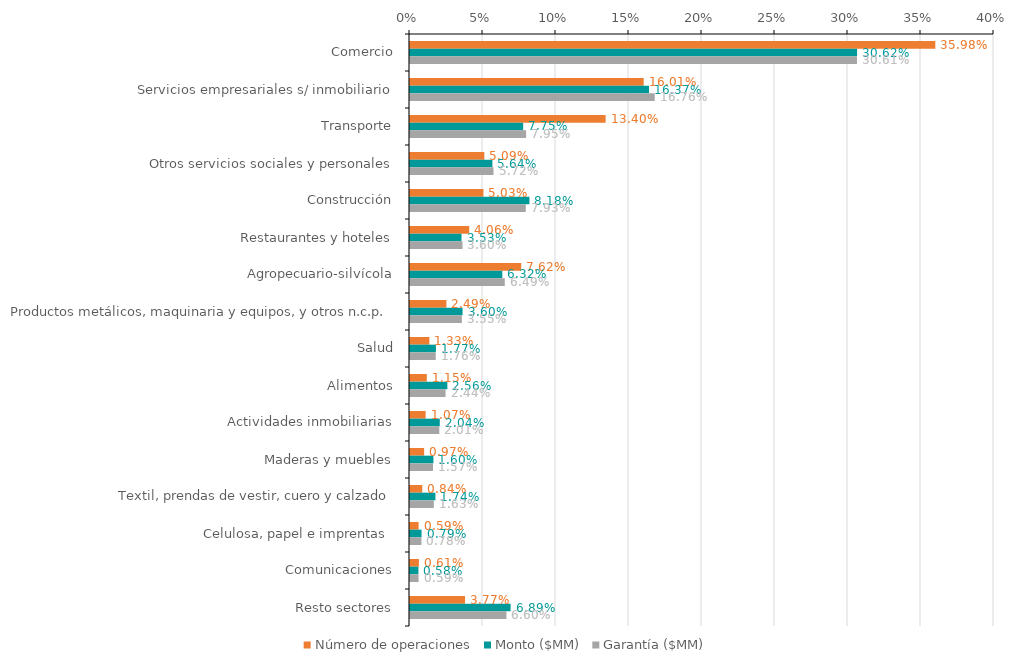
| Category | Número de operaciones | Monto ($MM) | Garantía ($MM) |
|---|---|---|---|
| Comercio | 0.36 | 0.306 | 0.306 |
| Servicios empresariales s/ inmobiliario | 0.16 | 0.164 | 0.168 |
| Transporte | 0.134 | 0.078 | 0.08 |
| Otros servicios sociales y personales | 0.051 | 0.056 | 0.057 |
| Construcción | 0.05 | 0.082 | 0.079 |
| Restaurantes y hoteles | 0.041 | 0.035 | 0.036 |
| Agropecuario-silvícola | 0.076 | 0.063 | 0.065 |
| Productos metálicos, maquinaria y equipos, y otros n.c.p. | 0.025 | 0.036 | 0.036 |
| Salud | 0.013 | 0.018 | 0.018 |
| Alimentos | 0.012 | 0.026 | 0.024 |
| Actividades inmobiliarias | 0.011 | 0.02 | 0.02 |
| Maderas y muebles | 0.01 | 0.016 | 0.016 |
| Textil, prendas de vestir, cuero y calzado | 0.008 | 0.017 | 0.016 |
| Celulosa, papel e imprentas  | 0.006 | 0.008 | 0.008 |
| Comunicaciones | 0.006 | 0.006 | 0.006 |
| Resto sectores | 0.038 | 0.069 | 0.066 |